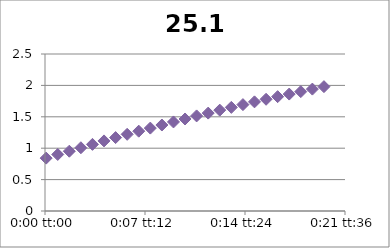
| Category | 25.1 |
|---|---|
| 5.78703703703704e-05 | 0.842 |
| 0.000636574074074074 | 0.9 |
| 0.00121527777777778 | 0.952 |
| 0.00179398148148148 | 1.007 |
| 0.00237268518518518 | 1.061 |
| 0.00295138888888889 | 1.116 |
| 0.00353009259259259 | 1.169 |
| 0.0041087962962963 | 1.221 |
| 0.0046875 | 1.271 |
| 0.0052662037037037 | 1.32 |
| 0.00584490740740741 | 1.369 |
| 0.00642361111111111 | 1.418 |
| 0.00700231481481481 | 1.465 |
| 0.00758101851851852 | 1.514 |
| 0.00815972222222222 | 1.559 |
| 0.00873842592592592 | 1.606 |
| 0.00931712962962963 | 1.65 |
| 0.00989583333333333 | 1.694 |
| 0.010474537037037 | 1.738 |
| 0.0110532407407407 | 1.779 |
| 0.0116319444444444 | 1.821 |
| 0.0122106481481481 | 1.862 |
| 0.0127893518518518 | 1.901 |
| 0.0133680555555556 | 1.941 |
| 0.0139467592592593 | 1.98 |